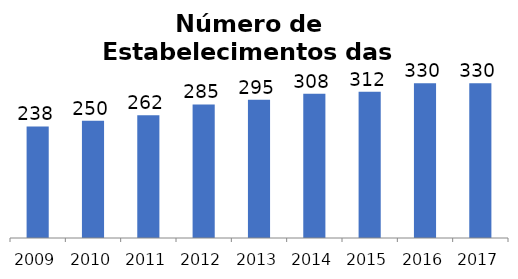
| Category | Total |
|---|---|
| 2009.0 | 238 |
| 2010.0 | 250 |
| 2011.0 | 262 |
| 2012.0 | 285 |
| 2013.0 | 295 |
| 2014.0 | 308 |
| 2015.0 | 312 |
| 2016.0 | 330 |
| 2017.0 | 330 |